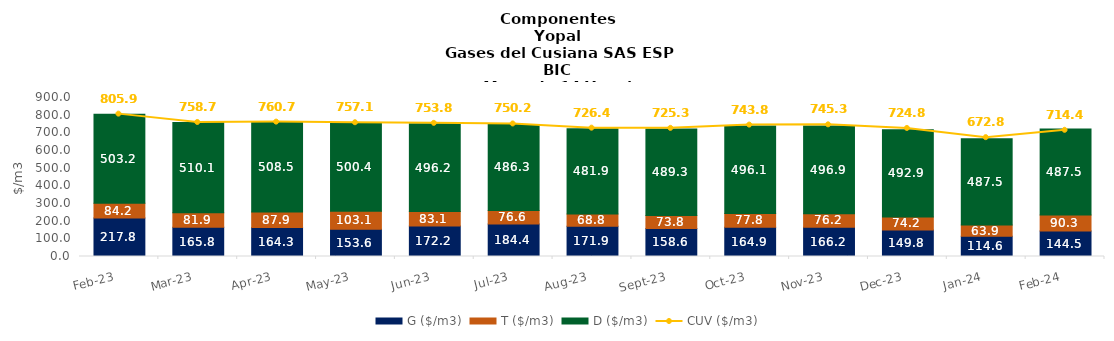
| Category | G ($/m3) | T ($/m3) | D ($/m3) |
|---|---|---|---|
| 2023-02-01 | 217.82 | 84.19 | 503.15 |
| 2023-03-01 | 165.84 | 81.88 | 510.12 |
| 2023-04-01 | 164.25 | 87.89 | 508.45 |
| 2023-05-01 | 153.57 | 103.08 | 500.4 |
| 2023-06-01 | 172.16 | 83.07 | 496.23 |
| 2023-07-01 | 184.42 | 76.55 | 486.26 |
| 2023-08-01 | 171.91 | 68.78 | 481.89 |
| 2023-09-01 | 158.55 | 73.83 | 489.25 |
| 2023-10-01 | 164.94 | 77.79 | 496.13 |
| 2023-11-01 | 166.18 | 76.24 | 496.87 |
| 2023-12-01 | 149.82 | 74.15 | 492.91 |
| 2024-01-01 | 114.55 | 63.9 | 487.46 |
| 2024-02-01 | 144.5 | 90.3 | 487.45 |